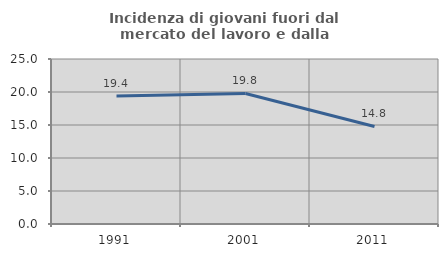
| Category | Incidenza di giovani fuori dal mercato del lavoro e dalla formazione  |
|---|---|
| 1991.0 | 19.386 |
| 2001.0 | 19.778 |
| 2011.0 | 14.779 |